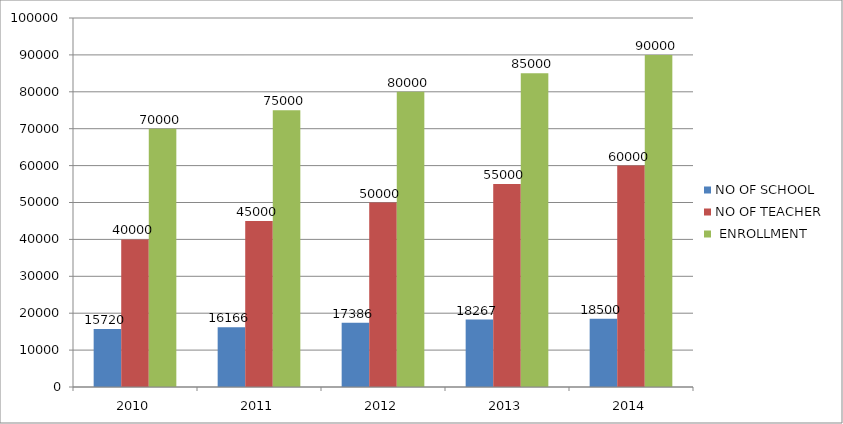
| Category | NO OF SCHOOL | NO OF TEACHER |  ENROLLMENT |
|---|---|---|---|
| 2010.0 | 15720 | 40000 | 70000 |
| 2011.0 | 16166 | 45000 | 75000 |
| 2012.0 | 17386 | 50000 | 80000 |
| 2013.0 | 18267 | 55000 | 85000 |
| 2014.0 | 18500 | 60000 | 90000 |